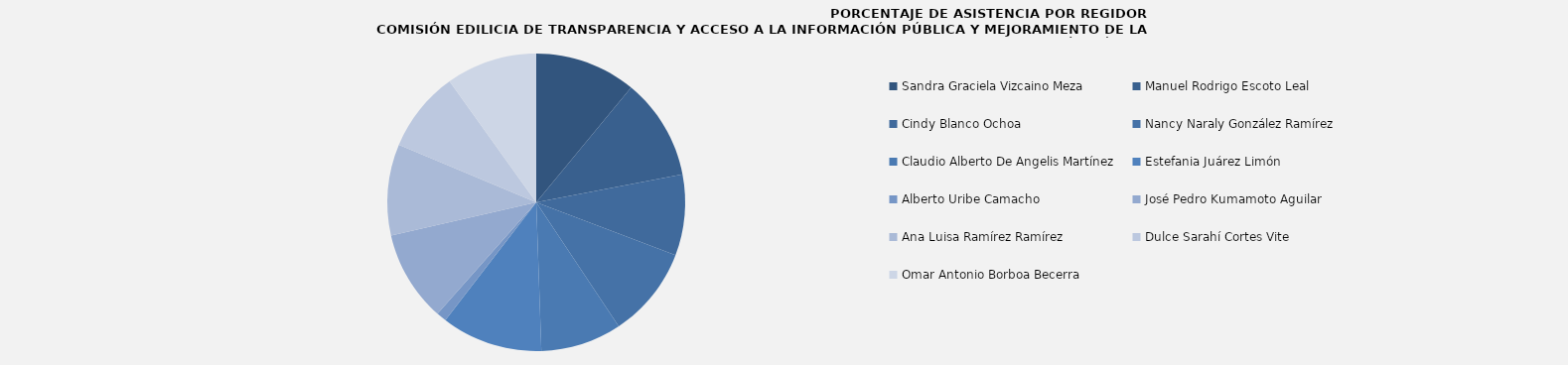
| Category | Sandra Graciela Vizcaino Meza |
|---|---|
| Sandra Graciela Vizcaino Meza | 100 |
| Manuel Rodrigo Escoto Leal | 100 |
| Cindy Blanco Ochoa | 80 |
| Nancy Naraly González Ramírez | 90 |
| Claudio Alberto De Angelis Martínez | 80 |
| Estefania Juárez Limón | 100 |
| Alberto Uribe Camacho | 10 |
| José Pedro Kumamoto Aguilar | 90 |
| Ana Luisa Ramírez Ramírez | 90 |
| Dulce Sarahí Cortes Vite | 80 |
| Omar Antonio Borboa Becerra | 90 |